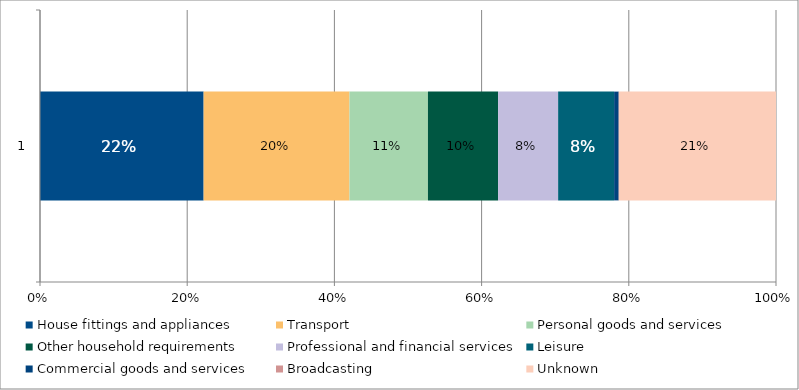
| Category | House fittings and appliances | Transport | Personal goods and services | Other household requirements | Professional and financial services | Leisure | Commercial goods and services | Broadcasting | Unknown |
|---|---|---|---|---|---|---|---|---|---|
| 0 | 0.222 | 0.198 | 0.107 | 0.095 | 0.082 | 0.076 | 0.006 | 0 | 0.213 |